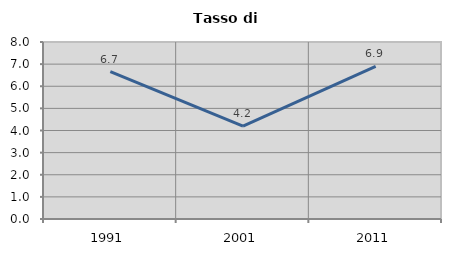
| Category | Tasso di disoccupazione   |
|---|---|
| 1991.0 | 6.664 |
| 2001.0 | 4.2 |
| 2011.0 | 6.897 |